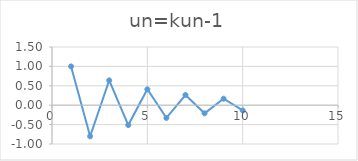
| Category | un=kun-1 |
|---|---|
| 1.0 | 1 |
| 2.0 | -0.8 |
| 3.0 | 0.64 |
| 4.0 | -0.512 |
| 5.0 | 0.41 |
| 6.0 | -0.328 |
| 7.0 | 0.262 |
| 8.0 | -0.21 |
| 9.0 | 0.168 |
| 10.0 | -0.134 |